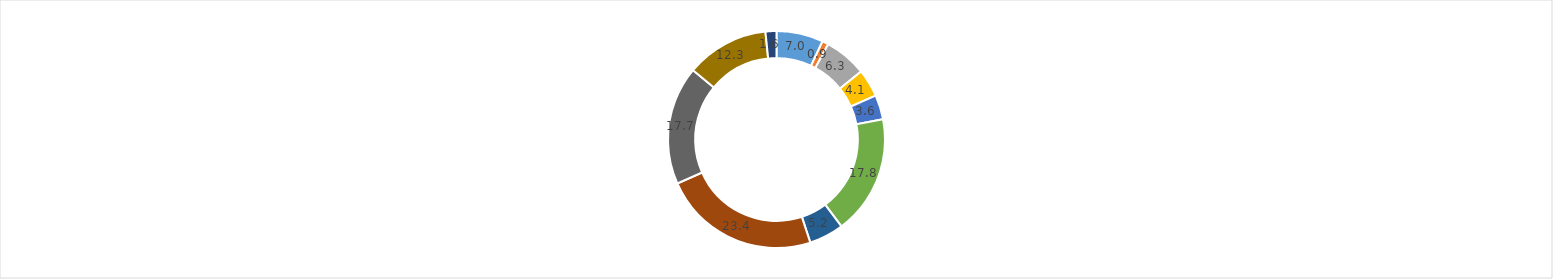
| Category | Series 0 |
|---|---|
| Амурская область | 6.976 |
| Еврейская автономная область | 0.932 |
| Забайкальский край | 6.322 |
| Камчатский край | 4.127 |
| Магаданская область | 3.65 |
| Приморский край | 17.785 |
| Республика Бурятия | 5.164 |
| Республика Саха (Якутия) | 23.396 |
| Сахалинская область | 17.681 |
| Хабаровский край | 12.338 |
| Чукотский автономный округ | 1.629 |